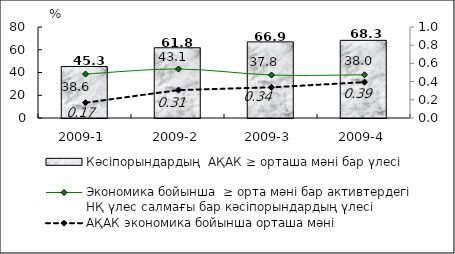
| Category | Кәсіпорындардың  АҚАК ≥ орташа мәні бар үлесі  |
|---|---|
| 2009-1 | 45.31 |
| 2009-2 | 61.75 |
| 2009-3 | 66.92 |
| 2009-4 | 68.27 |